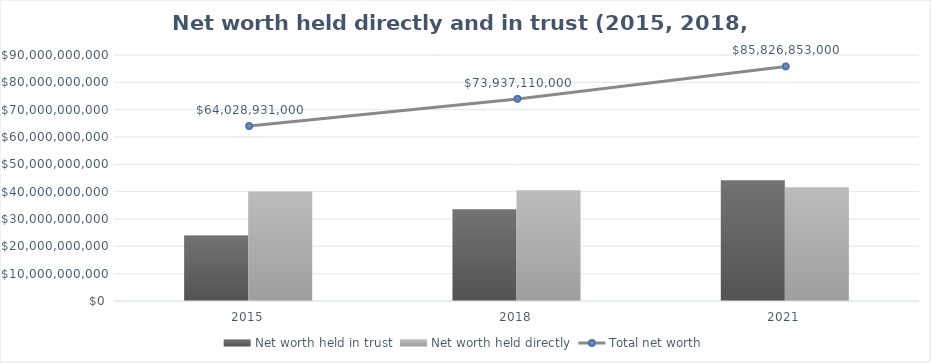
| Category | Net worth held in trust | Net worth held directly |
|---|---|---|
| 2015 | 23932953000 | 40095978000 |
| 2018 | 33537556000 | 40399555000 |
| 2021 | 44206811000 | 41620041000 |